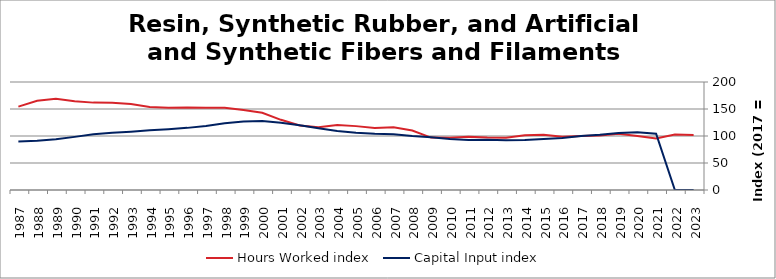
| Category | Hours Worked index | Capital Input index |
|---|---|---|
| 2023.0 | 102.057 | 0 |
| 2022.0 | 102.574 | 0 |
| 2021.0 | 95.585 | 104.193 |
| 2020.0 | 99.846 | 107.126 |
| 2019.0 | 103.949 | 105.529 |
| 2018.0 | 100.872 | 102.226 |
| 2017.0 | 100 | 100 |
| 2016.0 | 98.65 | 96.448 |
| 2015.0 | 102.084 | 94.477 |
| 2014.0 | 101.248 | 92.399 |
| 2013.0 | 96.706 | 92.173 |
| 2012.0 | 97.229 | 92.969 |
| 2011.0 | 98.525 | 92.69 |
| 2010.0 | 96.825 | 94.259 |
| 2009.0 | 97.01 | 97.739 |
| 2008.0 | 110.225 | 100.131 |
| 2007.0 | 116.023 | 103.411 |
| 2006.0 | 114.832 | 104.054 |
| 2005.0 | 118.292 | 106.113 |
| 2004.0 | 120.436 | 109.151 |
| 2003.0 | 116.39 | 114.422 |
| 2002.0 | 119.43 | 120.049 |
| 2001.0 | 129.972 | 124.654 |
| 2000.0 | 143.14 | 127.867 |
| 1999.0 | 148.32 | 126.958 |
| 1998.0 | 152.409 | 123.566 |
| 1997.0 | 152.318 | 118.707 |
| 1996.0 | 152.914 | 115.052 |
| 1995.0 | 152.445 | 112.535 |
| 1994.0 | 153.727 | 110.496 |
| 1993.0 | 159.057 | 107.917 |
| 1992.0 | 161.599 | 105.905 |
| 1991.0 | 161.809 | 103.06 |
| 1990.0 | 164.464 | 98.392 |
| 1989.0 | 168.915 | 94.051 |
| 1988.0 | 165.375 | 91.14 |
| 1987.0 | 154.373 | 89.901 |